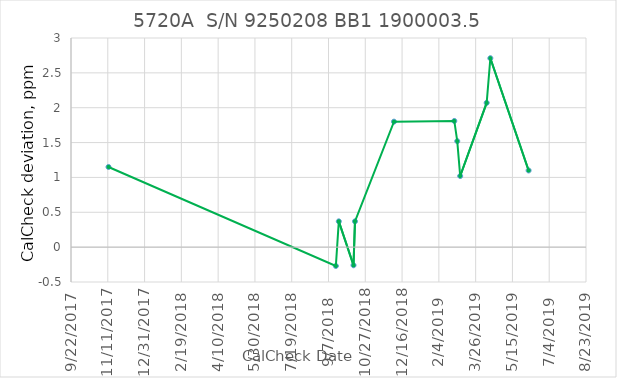
| Category | Series 0 |
|---|---|
| 43051.0 | 1.15 |
| 43360.0 | -0.27 |
| 43364.0 | 0.37 |
| 43384.0 | -0.26 |
| 43386.0 | 0.37 |
| 43439.0 | 1.8 |
| 43521.0 | 1.81 |
| 43525.0 | 1.52 |
| 43529.0 | 1.02 |
| 43565.0 | 2.07 |
| 43570.0 | 2.71 |
| 43622.0 | 1.1 |